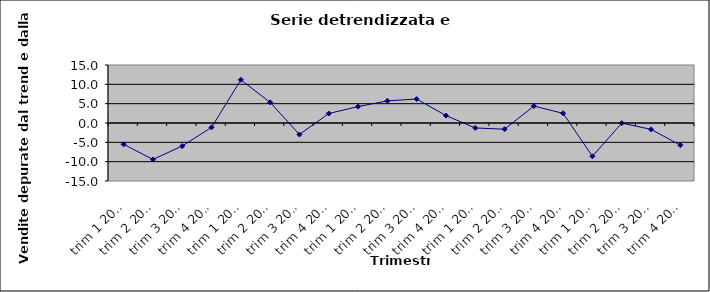
| Category | Serie detrendizzata |
|---|---|
| trim 1 2001 | -5.51 |
| trim 2 2001 | -9.43 |
| trim 3 2001 | -5.95 |
| trim 4 2001 | -1.13 |
| trim 1 2002 | 11.165 |
| trim 2 2002 | 5.345 |
| trim 3 2002 | -2.975 |
| trim 4 2002 | 2.445 |
| trim 1 2003 | 4.24 |
| trim 2 2003 | 5.72 |
| trim 3 2003 | 6.2 |
| trim 4 2003 | 1.92 |
| trim 1 2004 | -1.285 |
| trim 2 2004 | -1.605 |
| trim 3 2004 | 4.375 |
| trim 4 2004 | 2.495 |
| trim 1 2005 | -8.61 |
| trim 2 2005 | -0.03 |
| trim 3 2005 | -1.65 |
| trim 4 2005 | -5.73 |